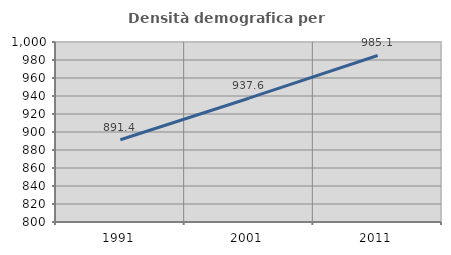
| Category | Densità demografica |
|---|---|
| 1991.0 | 891.414 |
| 2001.0 | 937.555 |
| 2011.0 | 985.053 |